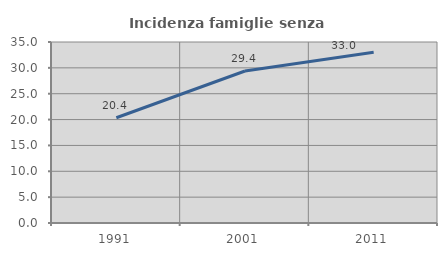
| Category | Incidenza famiglie senza nuclei |
|---|---|
| 1991.0 | 20.357 |
| 2001.0 | 29.386 |
| 2011.0 | 33.016 |